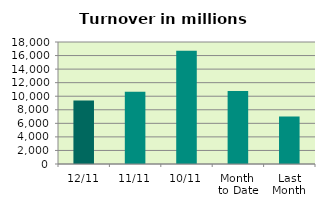
| Category | Series 0 |
|---|---|
| 12/11 | 9357.364 |
| 11/11 | 10675.854 |
| 10/11 | 16700.365 |
| Month 
to Date | 10783.743 |
| Last
Month | 7023.861 |